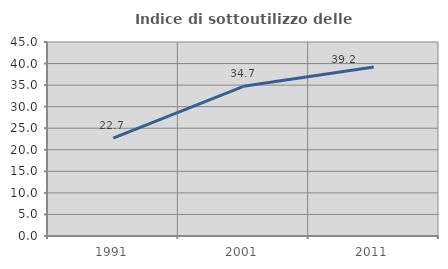
| Category | Indice di sottoutilizzo delle abitazioni  |
|---|---|
| 1991.0 | 22.727 |
| 2001.0 | 34.716 |
| 2011.0 | 39.205 |